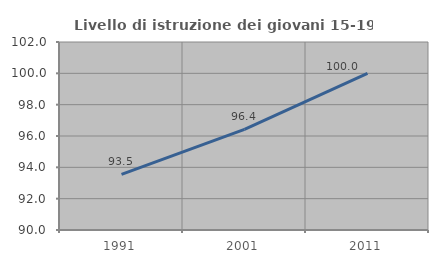
| Category | Livello di istruzione dei giovani 15-19 anni |
|---|---|
| 1991.0 | 93.548 |
| 2001.0 | 96.429 |
| 2011.0 | 100 |